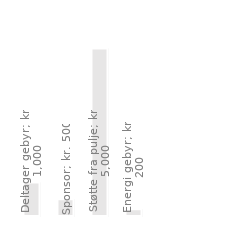
| Category | Stævne indtægter |
|---|---|
| Deltager gebyr | 1000 |
| Sponsor | 500 |
| Støtte fra pulje | 5000 |
| Energi gebyr | 200 |